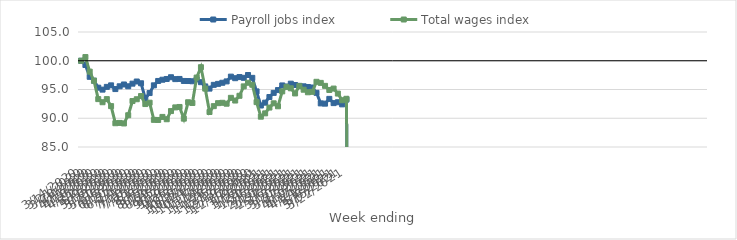
| Category | Payroll jobs index | Total wages index |
|---|---|---|
| 14/03/2020 | 100 | 100 |
| 21/03/2020 | 99.262 | 100.64 |
| 28/03/2020 | 97.206 | 98.106 |
| 04/04/2020 | 96.534 | 96.531 |
| 11/04/2020 | 95.318 | 93.328 |
| 18/04/2020 | 94.979 | 92.786 |
| 25/04/2020 | 95.456 | 93.327 |
| 02/05/2020 | 95.72 | 92.109 |
| 09/05/2020 | 95.074 | 89.134 |
| 16/05/2020 | 95.557 | 89.185 |
| 23/05/2020 | 95.874 | 89.094 |
| 30/05/2020 | 95.557 | 90.524 |
| 06/06/2020 | 96.019 | 92.994 |
| 13/06/2020 | 96.39 | 93.306 |
| 20/06/2020 | 96.084 | 93.861 |
| 27/06/2020 | 93.442 | 92.47 |
| 04/07/2020 | 94.382 | 92.706 |
| 11/07/2020 | 95.724 | 89.723 |
| 18/07/2020 | 96.484 | 89.703 |
| 25/07/2020 | 96.698 | 90.231 |
| 01/08/2020 | 96.831 | 89.827 |
| 08/08/2020 | 97.132 | 91.248 |
| 15/08/2020 | 96.806 | 91.888 |
| 22/08/2020 | 96.836 | 91.961 |
| 29/08/2020 | 96.484 | 89.929 |
| 05/09/2020 | 96.475 | 92.781 |
| 12/09/2020 | 96.432 | 92.656 |
| 19/09/2020 | 96.763 | 97.077 |
| 26/09/2020 | 96.272 | 98.876 |
| 03/10/2020 | 95.535 | 95.154 |
| 10/10/2020 | 95.156 | 91.086 |
| 17/10/2020 | 95.809 | 92.104 |
| 24/10/2020 | 95.978 | 92.622 |
| 31/10/2020 | 96.17 | 92.687 |
| 07/11/2020 | 96.408 | 92.529 |
| 14/11/2020 | 97.238 | 93.55 |
| 21/11/2020 | 96.967 | 93.081 |
| 28/11/2020 | 97.164 | 93.907 |
| 05/12/2020 | 97.03 | 95.542 |
| 12/12/2020 | 97.521 | 96.175 |
| 19/12/2020 | 97.026 | 95.83 |
| 26/12/2020 | 94.669 | 92.802 |
| 02/01/2021 | 92.214 | 90.275 |
| 09/01/2021 | 92.709 | 90.849 |
| 16/01/2021 | 93.691 | 91.859 |
| 23/01/2021 | 94.412 | 92.597 |
| 30/01/2021 | 94.898 | 92.08 |
| 06/02/2021 | 95.708 | 94.672 |
| 13/02/2021 | 95.516 | 95.459 |
| 20/02/2021 | 96.011 | 95.208 |
| 27/02/2021 | 95.779 | 94.314 |
| 06/03/2021 | 95.633 | 95.588 |
| 13/03/2021 | 95.555 | 94.964 |
| 20/03/2021 | 95.437 | 94.519 |
| 27/03/2021 | 95.347 | 94.591 |
| 03/04/2021 | 94.422 | 96.339 |
| 10/04/2021 | 92.583 | 96.152 |
| 17/04/2021 | 92.538 | 95.633 |
| 24/04/2021 | 93.37 | 94.917 |
| 01/05/2021 | 92.631 | 95.161 |
| 08/05/2021 | 92.783 | 94.293 |
| 15/05/2021 | 92.415 | 93.132 |
| 22/05/2021 | 93.243 | 93.384 |